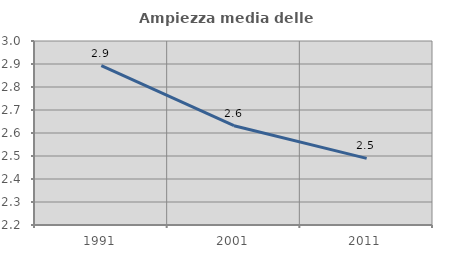
| Category | Ampiezza media delle famiglie |
|---|---|
| 1991.0 | 2.893 |
| 2001.0 | 2.632 |
| 2011.0 | 2.49 |